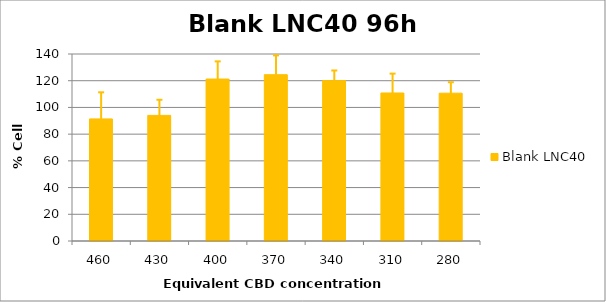
| Category | Blank LNC40 |
|---|---|
| 460.0 | 91.406 |
| 430.0 | 94.035 |
| 400.0 | 121.246 |
| 370.0 | 124.506 |
| 340.0 | 120.068 |
| 310.0 | 110.814 |
| 280.0 | 110.658 |